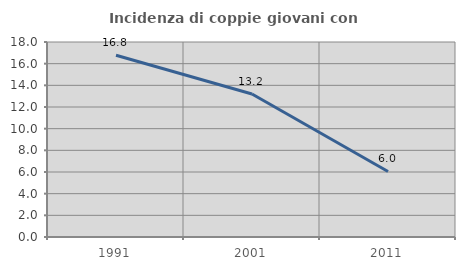
| Category | Incidenza di coppie giovani con figli |
|---|---|
| 1991.0 | 16.782 |
| 2001.0 | 13.203 |
| 2011.0 | 6.047 |